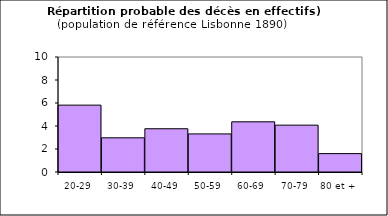
| Category | Series 0 |
|---|---|
| 20-29 | 5.815 |
| 30-39 | 2.972 |
| 40-49 | 3.761 |
| 50-59 | 3.312 |
| 60-69 | 4.363 |
| 70-79 | 4.074 |
| 80 et + | 1.598 |